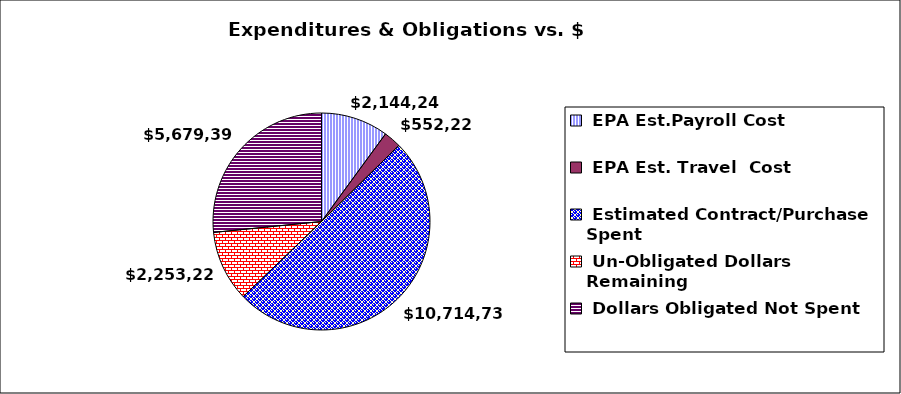
| Category | Series 0 |
|---|---|
| EPA Est.Payroll Cost | 2144244.23 |
| EPA Est. Travel  Cost | 552223.97 |
| Estimated Contract/Purchase Spent | 10714730.02 |
| Un-Obligated Dollars Remaining | 2253227.846 |
| Dollars Obligated Not Spent | 5679393.86 |